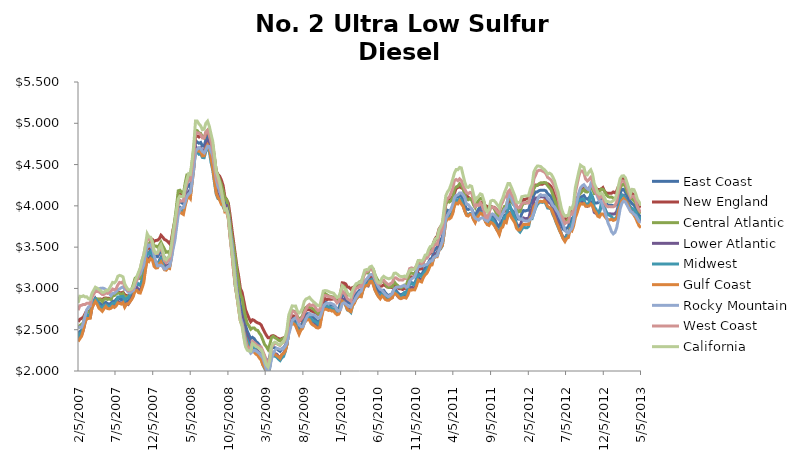
| Category | East Coast | New England  | Central Atlantic  | Lower Atlantic  | Midwest | Gulf Coast | Rocky Mountain | West Coast | California |
|---|---|---|---|---|---|---|---|---|---|
| 2/5/07 | 2.451 | 2.595 | 2.518 | 2.393 | 2.398 | 2.357 | 2.536 | 2.736 | 2.825 |
| 2/12/07 | 2.478 | 2.627 | 2.55 | 2.417 | 2.454 | 2.391 | 2.529 | 2.791 | 2.905 |
| 2/19/07 | 2.494 | 2.637 | 2.567 | 2.433 | 2.461 | 2.42 | 2.529 | 2.796 | 2.901 |
| 2/26/07 | 2.538 | 2.652 | 2.583 | 2.494 | 2.542 | 2.493 | 2.581 | 2.806 | 2.911 |
| 3/5/07 | 2.619 | 2.694 | 2.667 | 2.581 | 2.617 | 2.588 | 2.663 | 2.805 | 2.897 |
| 3/12/07 | 2.681 | 2.732 | 2.712 | 2.656 | 2.681 | 2.636 | 2.741 | 2.82 | 2.899 |
| 3/19/07 | 2.675 | 2.721 | 2.715 | 2.643 | 2.677 | 2.637 | 2.775 | 2.822 | 2.875 |
| 3/26/07 | 2.673 | 2.712 | 2.706 | 2.647 | 2.668 | 2.639 | 2.788 | 2.811 | 2.869 |
| 4/2/07 | 2.782 | 2.783 | 2.818 | 2.76 | 2.791 | 2.762 | 2.89 | 2.893 | 2.939 |
| 4/9/07 | 2.83 | 2.819 | 2.847 | 2.821 | 2.85 | 2.805 | 2.956 | 2.93 | 2.978 |
| 4/16/07 | 2.875 | 2.868 | 2.88 | 2.874 | 2.874 | 2.842 | 2.986 | 2.965 | 3.015 |
| 4/23/07 | 2.85 | 2.862 | 2.874 | 2.833 | 2.847 | 2.809 | 2.984 | 2.962 | 3.004 |
| 4/30/07 | 2.829 | 2.868 | 2.871 | 2.798 | 2.794 | 2.762 | 2.994 | 2.961 | 2.987 |
| 5/7/07 | 2.813 | 2.872 | 2.865 | 2.773 | 2.779 | 2.743 | 3.002 | 2.943 | 2.974 |
| 5/14/07 | 2.787 | 2.864 | 2.841 | 2.744 | 2.762 | 2.722 | 3.004 | 2.927 | 2.952 |
| 5/21/07 | 2.82 | 2.881 | 2.869 | 2.782 | 2.792 | 2.754 | 3 | 2.928 | 2.955 |
| 5/28/07 | 2.833 | 2.885 | 2.878 | 2.799 | 2.802 | 2.782 | 2.986 | 2.946 | 2.975 |
| 6/4/07 | 2.815 | 2.88 | 2.867 | 2.774 | 2.787 | 2.757 | 2.965 | 2.939 | 2.972 |
| 6/11/07 | 2.812 | 2.88 | 2.872 | 2.765 | 2.779 | 2.752 | 2.944 | 2.949 | 2.997 |
| 6/18/07 | 2.818 | 2.873 | 2.867 | 2.78 | 2.792 | 2.759 | 2.913 | 2.968 | 3.033 |
| 6/25/07 | 2.846 | 2.92 | 2.913 | 2.797 | 2.82 | 2.782 | 2.941 | 2.993 | 3.073 |
| 7/2/07 | 2.841 | 2.93 | 2.914 | 2.786 | 2.819 | 2.77 | 2.942 | 2.982 | 3.067 |
| 7/9/07 | 2.866 | 2.942 | 2.933 | 2.815 | 2.832 | 2.787 | 2.962 | 2.996 | 3.09 |
| 7/16/07 | 2.888 | 2.959 | 2.945 | 2.846 | 2.896 | 2.825 | 2.983 | 3.042 | 3.147 |
| 7/23/07 | 2.877 | 2.95 | 2.941 | 2.83 | 2.899 | 2.819 | 2.994 | 3.073 | 3.158 |
| 7/30/07 | 2.862 | 2.946 | 2.919 | 2.817 | 2.902 | 2.811 | 3.009 | 3.066 | 3.152 |
| 8/6/07 | 2.878 | 2.955 | 2.941 | 2.831 | 2.904 | 2.828 | 3.018 | 3.083 | 3.14 |
| 8/13/07 | 2.834 | 2.923 | 2.898 | 2.785 | 2.855 | 2.773 | 2.989 | 3.023 | 3.054 |
| 8/20/07 | 2.851 | 2.915 | 2.899 | 2.814 | 2.878 | 2.81 | 2.984 | 3.001 | 3.016 |
| 8/27/07 | 2.844 | 2.906 | 2.895 | 2.806 | 2.885 | 2.81 | 2.954 | 2.973 | 2.986 |
| 9/3/07 | 2.876 | 2.915 | 2.931 | 2.84 | 2.925 | 2.838 | 2.946 | 2.976 | 2.985 |
| 9/10/07 | 2.921 | 2.968 | 2.989 | 2.877 | 2.957 | 2.866 | 2.961 | 2.986 | 2.995 |
| 9/17/07 | 2.973 | 3.025 | 3.051 | 2.924 | 2.996 | 2.904 | 2.976 | 3.006 | 3.023 |
| 9/24/07 | 3.047 | 3.1 | 3.123 | 2.998 | 3.065 | 2.973 | 3.032 | 3.062 | 3.093 |
| 10/1/07 | 3.062 | 3.117 | 3.138 | 3.012 | 3.075 | 2.977 | 3.105 | 3.1 | 3.143 |
| 10/8/07 | 3.045 | 3.123 | 3.134 | 2.985 | 3.045 | 2.948 | 3.145 | 3.178 | 3.197 |
| 10/15/07 | 3.039 | 3.122 | 3.123 | 2.981 | 3.044 | 2.944 | 3.174 | 3.24 | 3.249 |
| 10/22/07 | 3.096 | 3.182 | 3.192 | 3.031 | 3.085 | 3.002 | 3.236 | 3.334 | 3.338 |
| 10/29/07 | 3.163 | 3.25 | 3.252 | 3.103 | 3.137 | 3.069 | 3.283 | 3.405 | 3.406 |
| 11/5/07 | 3.299 | 3.375 | 3.384 | 3.243 | 3.291 | 3.224 | 3.413 | 3.514 | 3.524 |
| 11/12/07 | 3.423 | 3.484 | 3.522 | 3.362 | 3.425 | 3.35 | 3.535 | 3.61 | 3.663 |
| 11/19/07 | 3.423 | 3.488 | 3.524 | 3.362 | 3.416 | 3.327 | 3.511 | 3.592 | 3.624 |
| 11/26/07 | 3.467 | 3.59 | 3.573 | 3.395 | 3.444 | 3.362 | 3.53 | 3.591 | 3.62 |
| 12/3/07 | 3.463 | 3.595 | 3.57 | 3.392 | 3.413 | 3.347 | 3.492 | 3.543 | 3.567 |
| 12/10/07 | 3.398 | 3.57 | 3.513 | 3.316 | 3.306 | 3.268 | 3.403 | 3.451 | 3.455 |
| 12/17/07 | 3.387 | 3.581 | 3.514 | 3.295 | 3.292 | 3.248 | 3.325 | 3.425 | 3.426 |
| 12/24/07 | 3.384 | 3.584 | 3.5 | 3.289 | 3.295 | 3.25 | 3.272 | 3.422 | 3.434 |
| 12/31/07 | 3.421 | 3.6 | 3.525 | 3.336 | 3.325 | 3.297 | 3.275 | 3.463 | 3.491 |
| 1/7/08 | 3.458 | 3.644 | 3.56 | 3.377 | 3.361 | 3.322 | 3.281 | 3.484 | 3.526 |
| 1/14/08 | 3.42 | 3.621 | 3.517 | 3.339 | 3.309 | 3.271 | 3.266 | 3.431 | 3.459 |
| 1/21/08 | 3.375 | 3.594 | 3.479 | 3.287 | 3.249 | 3.226 | 3.234 | 3.336 | 3.36 |
| 1/28/08 | 3.353 | 3.583 | 3.438 | 3.276 | 3.236 | 3.221 | 3.241 | 3.313 | 3.346 |
| 2/4/08 | 3.358 | 3.566 | 3.444 | 3.284 | 3.258 | 3.249 | 3.264 | 3.336 | 3.377 |
| 2/11/08 | 3.344 | 3.542 | 3.418 | 3.278 | 3.264 | 3.241 | 3.269 | 3.357 | 3.393 |
| 2/18/08 | 3.459 | 3.588 | 3.534 | 3.403 | 3.377 | 3.37 | 3.353 | 3.462 | 3.511 |
| 2/25/08 | 3.619 | 3.71 | 3.694 | 3.568 | 3.534 | 3.513 | 3.476 | 3.612 | 3.672 |
| 3/3/08 | 3.715 | 3.813 | 3.829 | 3.641 | 3.652 | 3.611 | 3.575 | 3.74 | 3.803 |
| 3/10/08 | 3.886 | 3.938 | 3.993 | 3.822 | 3.789 | 3.8 | 3.734 | 3.891 | 3.955 |
| 3/17/08 | 4.054 | 4.119 | 4.182 | 3.977 | 3.966 | 3.916 | 3.894 | 4.025 | 4.083 |
| 3/24/08 | 4.062 | 4.142 | 4.189 | 3.983 | 3.975 | 3.93 | 3.956 | 4.063 | 4.119 |
| 3/31/08 | 4.036 | 4.13 | 4.164 | 3.955 | 3.944 | 3.909 | 3.975 | 4.057 | 4.112 |
| 4/7/08 | 4.027 | 4.121 | 4.146 | 3.95 | 3.931 | 3.896 | 3.979 | 4.059 | 4.118 |
| 4/14/08 | 4.137 | 4.239 | 4.272 | 4.052 | 4.025 | 4.002 | 4.043 | 4.186 | 4.234 |
| 4/21/08 | 4.229 | 4.346 | 4.375 | 4.136 | 4.11 | 4.08 | 4.114 | 4.265 | 4.317 |
| 4/28/08 | 4.25 | 4.346 | 4.381 | 4.169 | 4.144 | 4.116 | 4.143 | 4.323 | 4.39 |
| 5/5/08 | 4.218 | 4.337 | 4.351 | 4.133 | 4.116 | 4.088 | 4.159 | 4.313 | 4.382 |
| 5/12/08 | 4.396 | 4.463 | 4.521 | 4.322 | 4.305 | 4.27 | 4.28 | 4.467 | 4.547 |
| 5/19/08 | 4.558 | 4.61 | 4.685 | 4.485 | 4.469 | 4.445 | 4.446 | 4.62 | 4.737 |
| 5/26/08 | 4.791 | 4.843 | 4.916 | 4.719 | 4.677 | 4.676 | 4.659 | 4.894 | 5.027 |
| 6/2/08 | 4.772 | 4.846 | 4.911 | 4.692 | 4.653 | 4.666 | 4.686 | 4.884 | 5.027 |
| 6/9/08 | 4.758 | 4.834 | 4.884 | 4.685 | 4.625 | 4.661 | 4.706 | 4.88 | 4.992 |
| 6/16/08 | 4.768 | 4.853 | 4.878 | 4.701 | 4.629 | 4.66 | 4.692 | 4.861 | 4.969 |
| 6/23/08 | 4.725 | 4.833 | 4.836 | 4.658 | 4.586 | 4.605 | 4.659 | 4.822 | 4.922 |
| 6/30/08 | 4.723 | 4.822 | 4.825 | 4.659 | 4.583 | 4.608 | 4.642 | 4.823 | 4.928 |
| 7/7/08 | 4.799 | 4.863 | 4.89 | 4.745 | 4.66 | 4.699 | 4.676 | 4.893 | 5.001 |
| 7/14/08 | 4.832 | 4.889 | 4.915 | 4.782 | 4.705 | 4.739 | 4.723 | 4.916 | 5.026 |
| 7/21/08 | 4.787 | 4.869 | 4.872 | 4.734 | 4.661 | 4.707 | 4.719 | 4.855 | 4.964 |
| 7/28/08 | 4.682 | 4.806 | 4.776 | 4.619 | 4.527 | 4.575 | 4.66 | 4.775 | 4.869 |
| 8/4/08 | 4.584 | 4.735 | 4.676 | 4.52 | 4.432 | 4.454 | 4.608 | 4.674 | 4.781 |
| 8/11/08 | 4.444 | 4.584 | 4.57 | 4.363 | 4.281 | 4.301 | 4.477 | 4.522 | 4.607 |
| 8/18/08 | 4.286 | 4.422 | 4.423 | 4.202 | 4.142 | 4.155 | 4.323 | 4.364 | 4.422 |
| 8/25/08 | 4.22 | 4.382 | 4.37 | 4.127 | 4.088 | 4.101 | 4.233 | 4.289 | 4.359 |
| 9/1/08 | 4.189 | 4.359 | 4.315 | 4.107 | 4.082 | 4.07 | 4.189 | 4.255 | 4.282 |
| 9/8/08 | 4.124 | 4.312 | 4.255 | 4.037 | 4.036 | 4.018 | 4.108 | 4.161 | 4.185 |
| 9/15/08 | 4.095 | 4.246 | 4.178 | 4.036 | 3.991 | 4.015 | 4.045 | 4.061 | 4.053 |
| 9/22/08 | 4.033 | 4.11 | 4.09 | 3.996 | 3.946 | 3.927 | 3.969 | 3.948 | 3.951 |
| 9/29/08 | 4.032 | 4.077 | 4.081 | 4.002 | 3.952 | 3.933 | 3.948 | 3.945 | 3.963 |
| 10/6/08 | 3.944 | 4.036 | 3.985 | 3.912 | 3.879 | 3.846 | 3.891 | 3.85 | 3.869 |
| 10/13/08 | 3.727 | 3.892 | 3.802 | 3.672 | 3.661 | 3.636 | 3.701 | 3.625 | 3.656 |
| 10/20/08 | 3.569 | 3.729 | 3.64 | 3.517 | 3.474 | 3.457 | 3.557 | 3.435 | 3.46 |
| 10/27/08 | 3.412 | 3.573 | 3.514 | 3.344 | 3.265 | 3.222 | 3.379 | 3.24 | 3.286 |
| 11/3/08 | 3.234 | 3.42 | 3.378 | 3.144 | 3.034 | 3.036 | 3.159 | 3.057 | 3.057 |
| 11/10/08 | 3.077 | 3.266 | 3.214 | 2.989 | 2.91 | 2.9 | 2.968 | 2.915 | 2.913 |
| 11/17/08 | 2.939 | 3.148 | 3.081 | 2.847 | 2.788 | 2.75 | 2.824 | 2.772 | 2.754 |
| 11/24/08 | 2.8 | 2.997 | 2.934 | 2.713 | 2.644 | 2.605 | 2.648 | 2.613 | 2.605 |
| 12/1/08 | 2.744 | 2.954 | 2.882 | 2.654 | 2.592 | 2.563 | 2.582 | 2.56 | 2.538 |
| 12/8/08 | 2.638 | 2.849 | 2.751 | 2.56 | 2.504 | 2.472 | 2.453 | 2.426 | 2.402 |
| 12/15/08 | 2.547 | 2.74 | 2.65 | 2.476 | 2.415 | 2.384 | 2.356 | 2.309 | 2.292 |
| 12/22/08 | 2.482 | 2.689 | 2.576 | 2.415 | 2.369 | 2.311 | 2.277 | 2.278 | 2.251 |
| 12/29/08 | 2.435 | 2.638 | 2.545 | 2.362 | 2.325 | 2.268 | 2.255 | 2.278 | 2.241 |
| 1/5/09 | 2.391 | 2.596 | 2.505 | 2.315 | 2.282 | 2.232 | 2.216 | 2.281 | 2.239 |
| 1/12/09 | 2.407 | 2.621 | 2.522 | 2.331 | 2.304 | 2.246 | 2.236 | 2.359 | 2.334 |
| 1/19/09 | 2.391 | 2.613 | 2.521 | 2.306 | 2.281 | 2.228 | 2.25 | 2.344 | 2.319 |
| 1/26/09 | 2.358 | 2.595 | 2.498 | 2.268 | 2.245 | 2.204 | 2.243 | 2.325 | 2.296 |
| 2/2/09 | 2.341 | 2.583 | 2.492 | 2.245 | 2.212 | 2.191 | 2.229 | 2.309 | 2.288 |
| 2/9/09 | 2.315 | 2.576 | 2.459 | 2.219 | 2.183 | 2.157 | 2.212 | 2.298 | 2.269 |
| 2/16/09 | 2.268 | 2.559 | 2.429 | 2.161 | 2.144 | 2.135 | 2.184 | 2.291 | 2.262 |
| 2/23/09 | 2.216 | 2.514 | 2.377 | 2.108 | 2.076 | 2.075 | 2.16 | 2.243 | 2.219 |
| 3/2/09 | 2.17 | 2.472 | 2.322 | 2.067 | 2.034 | 2.043 | 2.094 | 2.19 | 2.144 |
| 3/9/09 | 2.138 | 2.434 | 2.296 | 2.033 | 1.988 | 2.007 | 2.02 | 2.126 | 2.075 |
| 3/16/09 | 2.107 | 2.403 | 2.261 | 2.004 | 1.964 | 1.974 | 1.991 | 2.098 | 2.049 |
| 3/23/09 | 2.173 | 2.403 | 2.319 | 2.083 | 2.037 | 2.06 | 2.037 | 2.151 | 2.129 |
| 3/30/09 | 2.288 | 2.424 | 2.402 | 2.222 | 2.18 | 2.204 | 2.145 | 2.285 | 2.297 |
| 4/6/09 | 2.285 | 2.429 | 2.421 | 2.208 | 2.182 | 2.211 | 2.213 | 2.312 | 2.335 |
| 4/13/09 | 2.281 | 2.42 | 2.402 | 2.209 | 2.179 | 2.202 | 2.249 | 2.338 | 2.35 |
| 4/20/09 | 2.274 | 2.403 | 2.392 | 2.205 | 2.169 | 2.186 | 2.273 | 2.332 | 2.34 |
| 4/27/09 | 2.252 | 2.395 | 2.374 | 2.18 | 2.145 | 2.172 | 2.27 | 2.319 | 2.32 |
| 5/4/09 | 2.238 | 2.382 | 2.364 | 2.163 | 2.127 | 2.154 | 2.261 | 2.309 | 2.316 |
| 5/11/09 | 2.265 | 2.395 | 2.385 | 2.193 | 2.16 | 2.199 | 2.269 | 2.335 | 2.337 |
| 5/18/09 | 2.283 | 2.401 | 2.396 | 2.218 | 2.176 | 2.21 | 2.274 | 2.346 | 2.354 |
| 5/25/09 | 2.309 | 2.409 | 2.409 | 2.252 | 2.236 | 2.242 | 2.302 | 2.389 | 2.407 |
| 6/1/09 | 2.371 | 2.438 | 2.455 | 2.326 | 2.325 | 2.322 | 2.344 | 2.464 | 2.502 |
| 6/8/09 | 2.519 | 2.566 | 2.617 | 2.469 | 2.478 | 2.473 | 2.442 | 2.608 | 2.676 |
| 6/15/09 | 2.605 | 2.651 | 2.695 | 2.559 | 2.55 | 2.544 | 2.52 | 2.66 | 2.734 |
| 6/22/09 | 2.639 | 2.67 | 2.729 | 2.594 | 2.591 | 2.583 | 2.613 | 2.725 | 2.789 |
| 6/29/09 | 2.633 | 2.666 | 2.725 | 2.586 | 2.583 | 2.569 | 2.629 | 2.717 | 2.785 |
| 7/6/09 | 2.614 | 2.656 | 2.713 | 2.564 | 2.569 | 2.548 | 2.646 | 2.712 | 2.787 |
| 7/13/09 | 2.564 | 2.623 | 2.662 | 2.512 | 2.518 | 2.495 | 2.618 | 2.648 | 2.727 |
| 7/20/09 | 2.518 | 2.6 | 2.628 | 2.46 | 2.475 | 2.445 | 2.558 | 2.605 | 2.703 |
| 7/27/09 | 2.553 | 2.613 | 2.64 | 2.508 | 2.504 | 2.495 | 2.539 | 2.623 | 2.72 |
| 8/3/09 | 2.582 | 2.637 | 2.668 | 2.537 | 2.526 | 2.514 | 2.535 | 2.652 | 2.763 |
| 8/10/09 | 2.668 | 2.701 | 2.753 | 2.626 | 2.607 | 2.581 | 2.572 | 2.707 | 2.842 |
| 8/17/09 | 2.69 | 2.739 | 2.77 | 2.649 | 2.629 | 2.608 | 2.632 | 2.748 | 2.872 |
| 8/24/09 | 2.695 | 2.741 | 2.78 | 2.652 | 2.641 | 2.624 | 2.67 | 2.79 | 2.88 |
| 8/31/09 | 2.693 | 2.742 | 2.777 | 2.651 | 2.656 | 2.619 | 2.69 | 2.806 | 2.893 |
| 9/7/09 | 2.661 | 2.729 | 2.767 | 2.606 | 2.632 | 2.576 | 2.681 | 2.791 | 2.866 |
| 9/14/09 | 2.653 | 2.72 | 2.753 | 2.601 | 2.611 | 2.557 | 2.681 | 2.801 | 2.847 |
| 9/21/09 | 2.635 | 2.708 | 2.737 | 2.582 | 2.602 | 2.545 | 2.676 | 2.79 | 2.827 |
| 9/28/09 | 2.612 | 2.703 | 2.712 | 2.557 | 2.589 | 2.526 | 2.656 | 2.751 | 2.807 |
| 10/5/09 | 2.591 | 2.686 | 2.695 | 2.535 | 2.568 | 2.52 | 2.643 | 2.73 | 2.792 |
| 10/12/09 | 2.612 | 2.69 | 2.72 | 2.556 | 2.586 | 2.532 | 2.648 | 2.74 | 2.791 |
| 10/19/09 | 2.718 | 2.752 | 2.829 | 2.665 | 2.697 | 2.646 | 2.703 | 2.825 | 2.874 |
| 10/26/09 | 2.822 | 2.843 | 2.922 | 2.774 | 2.798 | 2.741 | 2.775 | 2.907 | 2.968 |
| 11/2/09 | 2.837 | 2.878 | 2.939 | 2.786 | 2.792 | 2.749 | 2.809 | 2.914 | 2.974 |
| 11/9/09 | 2.824 | 2.866 | 2.925 | 2.774 | 2.784 | 2.747 | 2.821 | 2.91 | 2.972 |
| 11/16/09 | 2.813 | 2.868 | 2.911 | 2.763 | 2.776 | 2.734 | 2.818 | 2.901 | 2.964 |
| 11/23/09 | 2.807 | 2.868 | 2.905 | 2.757 | 2.77 | 2.738 | 2.823 | 2.898 | 2.954 |
| 11/30/09 | 2.796 | 2.869 | 2.899 | 2.743 | 2.756 | 2.725 | 2.815 | 2.889 | 2.948 |
| 12/7/09 | 2.796 | 2.874 | 2.895 | 2.744 | 2.75 | 2.727 | 2.805 | 2.885 | 2.942 |
| 12/14/09 | 2.774 | 2.87 | 2.868 | 2.723 | 2.727 | 2.699 | 2.782 | 2.856 | 2.915 |
| 12/21/09 | 2.746 | 2.853 | 2.84 | 2.694 | 2.716 | 2.681 | 2.738 | 2.825 | 2.891 |
| 12/28/09 | 2.754 | 2.862 | 2.856 | 2.699 | 2.714 | 2.689 | 2.726 | 2.841 | 2.902 |
| 1/4/10 | 2.831 | 2.935 | 2.931 | 2.777 | 2.776 | 2.751 | 2.744 | 2.908 | 2.959 |
| 1/11/10 | 2.925 | 3.068 | 3.025 | 2.867 | 2.848 | 2.847 | 2.813 | 2.971 | 3.032 |
| 1/18/10 | 2.928 | 3.065 | 3.023 | 2.872 | 2.839 | 2.831 | 2.826 | 2.947 | 3.008 |
| 1/25/10 | 2.888 | 3.055 | 2.986 | 2.828 | 2.796 | 2.8 | 2.816 | 2.915 | 2.987 |
| 2/1/10 | 2.838 | 3.017 | 2.927 | 2.781 | 2.739 | 2.744 | 2.796 | 2.876 | 2.95 |
| 2/8/10 | 2.824 | 3.014 | 2.921 | 2.763 | 2.732 | 2.729 | 2.779 | 2.86 | 2.92 |
| 2/15/10 | 2.815 | 2.991 | 2.905 | 2.756 | 2.71 | 2.719 | 2.775 | 2.846 | 2.902 |
| 2/22/10 | 2.879 | 3.011 | 2.967 | 2.827 | 2.793 | 2.793 | 2.825 | 2.918 | 2.98 |
| 3/1/10 | 2.907 | 3.018 | 3.013 | 2.848 | 2.828 | 2.82 | 2.85 | 2.956 | 3.023 |
| 3/8/10 | 2.936 | 3.015 | 3.037 | 2.882 | 2.87 | 2.873 | 2.89 | 3.003 | 3.057 |
| 3/15/10 | 2.952 | 3.018 | 3.055 | 2.898 | 2.896 | 2.897 | 2.923 | 3.005 | 3.065 |
| 3/22/10 | 2.977 | 3.032 | 3.079 | 2.925 | 2.923 | 2.904 | 2.953 | 3.027 | 3.072 |
| 3/29/10 | 2.97 | 3.029 | 3.075 | 2.916 | 2.911 | 2.899 | 2.967 | 3.027 | 3.073 |
| 4/5/10 | 3.034 | 3.054 | 3.136 | 2.987 | 2.989 | 2.978 | 3.043 | 3.113 | 3.147 |
| 4/12/10 | 3.085 | 3.086 | 3.186 | 3.04 | 3.05 | 3.023 | 3.081 | 3.187 | 3.221 |
| 4/19/10 | 3.085 | 3.103 | 3.189 | 3.037 | 3.05 | 3.035 | 3.109 | 3.203 | 3.228 |
| 4/26/10 | 3.08 | 3.105 | 3.186 | 3.03 | 3.057 | 3.038 | 3.136 | 3.211 | 3.227 |
| 5/3/10 | 3.131 | 3.138 | 3.238 | 3.081 | 3.1 | 3.083 | 3.166 | 3.243 | 3.26 |
| 5/10/10 | 3.141 | 3.161 | 3.246 | 3.092 | 3.106 | 3.087 | 3.169 | 3.233 | 3.269 |
| 5/17/10 | 3.114 | 3.142 | 3.232 | 3.059 | 3.07 | 3.043 | 3.156 | 3.204 | 3.238 |
| 5/24/10 | 3.045 | 3.098 | 3.165 | 2.986 | 2.988 | 2.978 | 3.107 | 3.132 | 3.162 |
| 5/31/10 | 3.01 | 3.064 | 3.121 | 2.955 | 2.942 | 2.935 | 3.061 | 3.082 | 3.094 |
| 6/7/10 | 2.977 | 3.045 | 3.09 | 2.92 | 2.906 | 2.9 | 3.02 | 3.058 | 3.068 |
| 6/14/10 | 2.953 | 3.025 | 3.067 | 2.895 | 2.893 | 2.875 | 2.989 | 3.054 | 3.068 |
| 6/21/10 | 2.976 | 3.029 | 3.088 | 2.921 | 2.935 | 2.908 | 2.98 | 3.093 | 3.125 |
| 6/28/10 | 2.977 | 3.044 | 3.091 | 2.92 | 2.931 | 2.893 | 2.955 | 3.099 | 3.147 |
| 7/5/10 | 2.946 | 3.033 | 3.055 | 2.889 | 2.893 | 2.866 | 2.927 | 3.077 | 3.132 |
| 7/12/10 | 2.923 | 3.017 | 3.022 | 2.871 | 2.866 | 2.857 | 2.911 | 3.057 | 3.123 |
| 7/19/10 | 2.913 | 3.015 | 3.012 | 2.861 | 2.866 | 2.859 | 2.902 | 3.042 | 3.116 |
| 7/26/10 | 2.928 | 3.014 | 3.02 | 2.88 | 2.891 | 2.875 | 2.92 | 3.06 | 3.125 |
| 8/2/10 | 2.934 | 3.009 | 3.02 | 2.89 | 2.9 | 2.887 | 2.937 | 3.071 | 3.132 |
| 8/9/10 | 3 | 3.027 | 3.086 | 2.962 | 2.966 | 2.947 | 2.991 | 3.124 | 3.183 |
| 8/16/10 | 2.977 | 3.024 | 3.055 | 2.94 | 2.953 | 2.933 | 3.011 | 3.129 | 3.186 |
| 8/23/10 | 2.952 | 3.009 | 3.038 | 2.91 | 2.927 | 2.916 | 3.016 | 3.114 | 3.171 |
| 8/30/10 | 2.93 | 2.996 | 3.02 | 2.886 | 2.909 | 2.888 | 3.019 | 3.101 | 3.15 |
| 9/6/10 | 2.923 | 2.995 | 3.007 | 2.88 | 2.9 | 2.876 | 3.021 | 3.104 | 3.145 |
| 9/13/10 | 2.932 | 2.987 | 3.019 | 2.89 | 2.92 | 2.887 | 3.031 | 3.101 | 3.142 |
| 9/20/10 | 2.949 | 2.997 | 3.041 | 2.905 | 2.944 | 2.89 | 3.037 | 3.12 | 3.15 |
| 9/27/10 | 2.946 | 3.004 | 3.034 | 2.904 | 2.928 | 2.883 | 3.014 | 3.121 | 3.139 |
| 10/4/10 | 2.997 | 3.04 | 3.095 | 2.952 | 2.99 | 2.92 | 3.024 | 3.165 | 3.179 |
| 10/11/10 | 3.065 | 3.118 | 3.178 | 3.011 | 3.055 | 2.982 | 3.085 | 3.239 | 3.215 |
| 10/18/10 | 3.072 | 3.14 | 3.188 | 3.016 | 3.063 | 2.979 | 3.112 | 3.249 | 3.232 |
| 10/25/10 | 3.064 | 3.136 | 3.18 | 3.008 | 3.048 | 2.985 | 3.128 | 3.243 | 3.229 |
| 11/1/10 | 3.063 | 3.147 | 3.181 | 3.005 | 3.049 | 2.982 | 3.141 | 3.242 | 3.237 |
| 11/8/10 | 3.114 | 3.17 | 3.225 | 3.061 | 3.102 | 3.03 | 3.199 | 3.273 | 3.279 |
| 11/15/10 | 3.187 | 3.23 | 3.303 | 3.133 | 3.167 | 3.1 | 3.278 | 3.329 | 3.339 |
| 11/22/10 | 3.172 | 3.235 | 3.293 | 3.115 | 3.156 | 3.087 | 3.265 | 3.316 | 3.34 |
| 11/29/10 | 3.166 | 3.237 | 3.288 | 3.108 | 3.144 | 3.078 | 3.272 | 3.3 | 3.328 |
| 12/6/10 | 3.206 | 3.315 | 3.328 | 3.144 | 3.175 | 3.132 | 3.276 | 3.321 | 3.352 |
| 12/13/10 | 3.248 | 3.373 | 3.364 | 3.187 | 3.205 | 3.163 | 3.285 | 3.361 | 3.403 |
| 12/20/10 | 3.26 | 3.375 | 3.381 | 3.197 | 3.229 | 3.183 | 3.29 | 3.366 | 3.407 |
| 12/27/10 | 3.313 | 3.406 | 3.428 | 3.256 | 3.278 | 3.226 | 3.311 | 3.405 | 3.47 |
| 1/3/11 | 3.357 | 3.427 | 3.47 | 3.303 | 3.303 | 3.279 | 3.332 | 3.443 | 3.507 |
| 1/10/11 | 3.364 | 3.45 | 3.478 | 3.308 | 3.302 | 3.284 | 3.334 | 3.445 | 3.516 |
| 1/17/11 | 3.448 | 3.56 | 3.556 | 3.392 | 3.371 | 3.366 | 3.374 | 3.509 | 3.562 |
| 1/24/11 | 3.48 | 3.609 | 3.59 | 3.421 | 3.392 | 3.382 | 3.388 | 3.531 | 3.602 |
| 1/31/11 | 3.494 | 3.633 | 3.611 | 3.432 | 3.399 | 3.384 | 3.396 | 3.533 | 3.612 |
| 2/7/11 | 3.565 | 3.717 | 3.682 | 3.501 | 3.475 | 3.455 | 3.459 | 3.63 | 3.707 |
| 2/14/11 | 3.587 | 3.749 | 3.7 | 3.524 | 3.479 | 3.489 | 3.511 | 3.671 | 3.747 |
| 2/21/11 | 3.62 | 3.769 | 3.734 | 3.557 | 3.517 | 3.522 | 3.568 | 3.729 | 3.799 |
| 2/28/11 | 3.764 | 3.903 | 3.875 | 3.703 | 3.661 | 3.656 | 3.698 | 3.892 | 3.964 |
| 3/7/11 | 3.908 | 4.046 | 4.014 | 3.85 | 3.823 | 3.812 | 3.845 | 4.046 | 4.122 |
| 3/14/11 | 3.946 | 4.081 | 4.061 | 3.885 | 3.859 | 3.842 | 3.888 | 4.091 | 4.17 |
| 3/21/11 | 3.938 | 4.087 | 4.046 | 3.878 | 3.855 | 3.841 | 3.925 | 4.104 | 4.199 |
| 3/28/11 | 3.952 | 4.095 | 4.061 | 3.892 | 3.883 | 3.857 | 3.959 | 4.155 | 4.256 |
| 4/4/11 | 3.982 | 4.109 | 4.092 | 3.923 | 3.932 | 3.905 | 4.017 | 4.209 | 4.323 |
| 4/11/11 | 4.082 | 4.154 | 4.204 | 4.024 | 4.04 | 4.001 | 4.097 | 4.308 | 4.397 |
| 4/18/11 | 4.111 | 4.212 | 4.229 | 4.051 | 4.068 | 4.033 | 4.126 | 4.319 | 4.44 |
| 4/25/11 | 4.105 | 4.222 | 4.238 | 4.038 | 4.061 | 4.024 | 4.134 | 4.305 | 4.438 |
| 5/2/11 | 4.128 | 4.231 | 4.269 | 4.059 | 4.086 | 4.06 | 4.156 | 4.328 | 4.465 |
| 5/9/11 | 4.117 | 4.218 | 4.248 | 4.052 | 4.066 | 4.022 | 4.156 | 4.307 | 4.459 |
| 5/16/11 | 4.075 | 4.207 | 4.21 | 4.005 | 4.015 | 3.996 | 4.134 | 4.248 | 4.371 |
| 5/23/11 | 4.011 | 4.161 | 4.138 | 3.943 | 3.942 | 3.935 | 4.101 | 4.201 | 4.287 |
| 5/30/11 | 3.962 | 4.121 | 4.082 | 3.897 | 3.896 | 3.884 | 4.02 | 4.161 | 4.227 |
| 6/6/11 | 3.955 | 4.105 | 4.074 | 3.891 | 3.889 | 3.877 | 4.015 | 4.146 | 4.223 |
| 6/13/11 | 3.968 | 4.087 | 4.088 | 3.905 | 3.905 | 3.896 | 3.988 | 4.163 | 4.245 |
| 6/20/11 | 3.962 | 4.077 | 4.074 | 3.904 | 3.904 | 3.896 | 3.959 | 4.156 | 4.236 |
| 6/27/11 | 3.914 | 4.038 | 4.014 | 3.86 | 3.842 | 3.834 | 3.885 | 4.069 | 4.146 |
| 7/4/11 | 3.87 | 4.009 | 3.978 | 3.812 | 3.818 | 3.798 | 3.851 | 3.993 | 4.065 |
| 7/11/11 | 3.926 | 4.012 | 4.034 | 3.872 | 3.875 | 3.856 | 3.838 | 4.012 | 4.099 |
| 7/18/11 | 3.963 | 4.034 | 4.066 | 3.912 | 3.903 | 3.882 | 3.827 | 4.005 | 4.114 |
| 7/25/11 | 3.988 | 4.037 | 4.09 | 3.94 | 3.925 | 3.913 | 3.848 | 4.038 | 4.145 |
| 8/1/11 | 3.974 | 4.045 | 4.09 | 3.918 | 3.918 | 3.904 | 3.855 | 4 | 4.136 |
| 8/8/11 | 3.936 | 4.031 | 4.053 | 3.877 | 3.875 | 3.868 | 3.851 | 3.949 | 4.067 |
| 8/15/11 | 3.871 | 4.001 | 3.983 | 3.811 | 3.815 | 3.806 | 3.826 | 3.863 | 3.957 |
| 8/22/11 | 3.844 | 3.994 | 3.944 | 3.788 | 3.789 | 3.772 | 3.815 | 3.855 | 3.928 |
| 8/29/11 | 3.843 | 3.977 | 3.93 | 3.793 | 3.803 | 3.763 | 3.839 | 3.908 | 3.958 |
| 9/5/11 | 3.886 | 3.994 | 3.987 | 3.833 | 3.852 | 3.8 | 3.89 | 3.981 | 4.058 |
| 9/12/11 | 3.879 | 3.985 | 3.985 | 3.825 | 3.841 | 3.79 | 3.903 | 3.984 | 4.067 |
| 9/19/11 | 3.853 | 3.983 | 3.968 | 3.792 | 3.799 | 3.765 | 3.892 | 3.977 | 4.062 |
| 9/26/11 | 3.804 | 3.963 | 3.922 | 3.739 | 3.738 | 3.73 | 3.867 | 3.957 | 4.039 |
| 10/3/11 | 3.765 | 3.941 | 3.881 | 3.699 | 3.699 | 3.693 | 3.846 | 3.927 | 4.007 |
| 10/10/11 | 3.741 | 3.912 | 3.86 | 3.674 | 3.671 | 3.651 | 3.828 | 3.91 | 3.977 |
| 10/17/11 | 3.815 | 3.907 | 3.922 | 3.761 | 3.754 | 3.726 | 3.885 | 4.01 | 4.053 |
| 10/24/11 | 3.832 | 3.925 | 3.946 | 3.775 | 3.782 | 3.745 | 3.909 | 4.049 | 4.096 |
| 10/31/11 | 3.886 | 3.935 | 3.994 | 3.836 | 3.866 | 3.808 | 3.959 | 4.107 | 4.163 |
| 11/7/11 | 3.875 | 3.95 | 3.997 | 3.816 | 3.863 | 3.796 | 3.978 | 4.109 | 4.213 |
| 11/14/11 | 3.964 | 4.03 | 4.085 | 3.906 | 3.987 | 3.882 | 4.093 | 4.171 | 4.27 |
| 11/21/11 | 3.984 | 4.056 | 4.1 | 3.918 | 4.01 | 3.903 | 4.144 | 4.191 | 4.271 |
| 11/28/11 | 3.953 | 4.045 | 4.057 | 3.882 | 3.949 | 3.859 | 4.094 | 4.142 | 4.224 |
| 12/5/11 | 3.934 | 4.036 | 4.018 | 3.862 | 3.907 | 3.828 | 4.035 | 4.105 | 4.172 |
| 12/12/11 | 3.917 | 4.032 | 4.003 | 3.83 | 3.848 | 3.794 | 3.991 | 4.061 | 4.122 |
| 12/19/11 | 3.873 | 3.995 | 3.963 | 3.783 | 3.765 | 3.727 | 3.913 | 3.992 | 4.047 |
| 12/26/11 | 3.84 | 3.973 | 3.925 | 3.752 | 3.706 | 3.708 | 3.861 | 3.978 | 4.039 |
| 1/2/12 | 3.844 | 3.973 | 3.932 | 3.754 | 3.683 | 3.709 | 3.836 | 3.979 | 4.046 |
| 1/9/12 | 3.908 | 4.029 | 3.996 | 3.82 | 3.717 | 3.75 | 3.843 | 4.026 | 4.111 |
| 1/16/12 | 3.943 | 4.076 | 4.031 | 3.853 | 3.746 | 3.777 | 3.823 | 4.037 | 4.116 |
| 1/23/12 | 3.938 | 4.077 | 4.03 | 3.843 | 3.736 | 3.774 | 3.817 | 4.037 | 4.121 |
| 1/30/12 | 3.945 | 4.088 | 4.04 | 3.848 | 3.734 | 3.776 | 3.816 | 4.033 | 4.12 |
| 2/6/12 | 3.948 | 4.101 | 4.046 | 3.846 | 3.751 | 3.775 | 3.817 | 4.036 | 4.128 |
| 2/13/12 | 4.028 | 4.15 | 4.128 | 3.93 | 3.857 | 3.86 | 3.841 | 4.121 | 4.209 |
| 2/20/12 | 4.053 | 4.161 | 4.142 | 3.966 | 3.848 | 3.886 | 3.857 | 4.164 | 4.258 |
| 2/27/12 | 4.134 | 4.221 | 4.208 | 4.063 | 3.914 | 3.992 | 3.919 | 4.326 | 4.41 |
| 3/5/12 | 4.167 | 4.253 | 4.243 | 4.094 | 3.974 | 4.02 | 3.986 | 4.372 | 4.454 |
| 3/12/12 | 4.169 | 4.25 | 4.247 | 4.096 | 4.016 | 4.036 | 4.069 | 4.421 | 4.483 |
| 3/19/12 | 4.184 | 4.259 | 4.269 | 4.106 | 4.04 | 4.053 | 4.119 | 4.431 | 4.481 |
| 3/26/12 | 4.19 | 4.263 | 4.279 | 4.11 | 4.046 | 4.055 | 4.136 | 4.433 | 4.476 |
| 4/2/12 | 4.19 | 4.262 | 4.28 | 4.109 | 4.042 | 4.049 | 4.125 | 4.42 | 4.456 |
| 4/9/12 | 4.19 | 4.278 | 4.282 | 4.106 | 4.055 | 4.063 | 4.129 | 4.411 | 4.44 |
| 4/16/12 | 4.181 | 4.269 | 4.28 | 4.091 | 4.021 | 4.038 | 4.129 | 4.389 | 4.418 |
| 4/23/12 | 4.146 | 4.269 | 4.245 | 4.05 | 3.974 | 3.993 | 4.09 | 4.345 | 4.384 |
| 4/30/12 | 4.13 | 4.255 | 4.22 | 4.039 | 3.971 | 3.98 | 4.072 | 4.33 | 4.396 |
| 5/7/12 | 4.108 | 4.232 | 4.194 | 4.021 | 3.962 | 3.962 | 4.047 | 4.312 | 4.385 |
| 5/14/12 | 4.054 | 4.192 | 4.135 | 3.969 | 3.897 | 3.915 | 4.004 | 4.277 | 4.349 |
| 5/21/12 | 3.999 | 4.13 | 4.079 | 3.916 | 3.854 | 3.861 | 3.987 | 4.233 | 4.303 |
| 5/28/12 | 3.94 | 4.072 | 4.023 | 3.854 | 3.795 | 3.802 | 3.948 | 4.164 | 4.228 |
| 6/4/12 | 3.886 | 4.036 | 3.968 | 3.797 | 3.746 | 3.757 | 3.919 | 4.101 | 4.169 |
| 6/11/12 | 3.818 | 3.974 | 3.909 | 3.721 | 3.696 | 3.698 | 3.873 | 3.991 | 4.066 |
| 6/18/12 | 3.766 | 3.923 | 3.868 | 3.66 | 3.655 | 3.654 | 3.832 | 3.899 | 3.966 |
| 6/25/12 | 3.718 | 3.873 | 3.817 | 3.616 | 3.606 | 3.601 | 3.779 | 3.839 | 3.908 |
| 7/2/12 | 3.702 | 3.843 | 3.793 | 3.607 | 3.58 | 3.568 | 3.705 | 3.787 | 3.876 |
| 7/9/12 | 3.731 | 3.84 | 3.818 | 3.646 | 3.638 | 3.605 | 3.68 | 3.798 | 3.882 |
| 7/16/12 | 3.741 | 3.848 | 3.838 | 3.648 | 3.659 | 3.617 | 3.672 | 3.803 | 3.886 |
| 7/23/12 | 3.826 | 3.916 | 3.9 | 3.753 | 3.749 | 3.711 | 3.701 | 3.901 | 3.976 |
| 7/30/12 | 3.842 | 3.931 | 3.908 | 3.775 | 3.782 | 3.696 | 3.729 | 3.898 | 3.967 |
| 8/6/12 | 3.869 | 3.946 | 3.934 | 3.806 | 3.851 | 3.752 | 3.813 | 3.959 | 4.023 |
| 8/13/12 | 3.952 | 4.011 | 4.004 | 3.901 | 3.968 | 3.856 | 3.958 | 4.152 | 4.215 |
| 8/20/12 | 4.006 | 4.087 | 4.069 | 3.944 | 4.015 | 3.911 | 4.062 | 4.254 | 4.313 |
| 8/27/12 | 4.072 | 4.132 | 4.129 | 4.019 | 4.05 | 3.981 | 4.149 | 4.353 | 4.409 |
| 9/3/12 | 4.104 | 4.194 | 4.153 | 4.051 | 4.072 | 4.026 | 4.217 | 4.424 | 4.493 |
| 9/10/12 | 4.113 | 4.208 | 4.175 | 4.049 | 4.079 | 4.021 | 4.242 | 4.423 | 4.477 |
| 9/17/12 | 4.125 | 4.215 | 4.196 | 4.056 | 4.08 | 4.028 | 4.256 | 4.399 | 4.466 |
| 9/24/12 | 4.092 | 4.191 | 4.17 | 4.015 | 4.017 | 3.995 | 4.228 | 4.323 | 4.386 |
| 10/1/12 | 4.081 | 4.195 | 4.168 | 3.995 | 4.013 | 3.999 | 4.205 | 4.301 | 4.376 |
| 10/8/12 | 4.097 | 4.217 | 4.185 | 4.009 | 4.04 | 3.999 | 4.194 | 4.319 | 4.414 |
| 10/15/12 | 4.128 | 4.238 | 4.208 | 4.047 | 4.15 | 4.022 | 4.268 | 4.346 | 4.437 |
| 10/22/12 | 4.108 | 4.243 | 4.203 | 4.011 | 4.101 | 3.999 | 4.243 | 4.298 | 4.385 |
| 10/29/12 | 4.036 | 4.205 | 4.149 | 3.921 | 3.984 | 3.945 | 4.195 | 4.187 | 4.268 |
| 11/5/12 | 4.034 | 4.211 | 4.155 | 3.91 | 3.959 | 3.92 | 4.16 | 4.153 | 4.225 |
| 11/12/12 | 4.037 | 4.198 | 4.165 | 3.912 | 3.908 | 3.875 | 4.104 | 4.131 | 4.16 |
| 11/19/12 | 4.052 | 4.197 | 4.171 | 3.935 | 3.909 | 3.865 | 4.059 | 4.094 | 4.142 |
| 11/26/12 | 4.092 | 4.203 | 4.203 | 3.99 | 4.023 | 3.902 | 4.057 | 4.115 | 4.153 |
| 12/3/12 | 4.096 | 4.221 | 4.202 | 3.994 | 4.014 | 3.901 | 3.989 | 4.097 | 4.139 |
| 12/10/12 | 4.069 | 4.175 | 4.174 | 3.97 | 3.977 | 3.874 | 3.938 | 4.042 | 4.093 |
| 12/17/12 | 4.027 | 4.155 | 4.134 | 3.923 | 3.918 | 3.847 | 3.866 | 3.997 | 4.051 |
| 12/24/12 | 4.006 | 4.153 | 4.112 | 3.899 | 3.893 | 3.833 | 3.791 | 3.989 | 4.052 |
| 12/31/12 | 4.006 | 4.154 | 4.105 | 3.904 | 3.885 | 3.83 | 3.746 | 3.991 | 4.045 |
| 1/7/13 | 4.006 | 4.153 | 4.107 | 3.902 | 3.87 | 3.837 | 3.688 | 3.988 | 4.048 |
| 1/14/13 | 4.002 | 4.168 | 4.094 | 3.901 | 3.834 | 3.824 | 3.661 | 3.988 | 4.063 |
| 1/21/13 | 4 | 4.158 | 4.089 | 3.904 | 3.845 | 3.831 | 3.678 | 4.004 | 4.082 |
| 1/28/13 | 4.023 | 4.181 | 4.106 | 3.931 | 3.866 | 3.845 | 3.736 | 4.049 | 4.137 |
| 2/4/13 | 4.088 | 4.237 | 4.165 | 4.001 | 3.978 | 3.941 | 3.844 | 4.166 | 4.242 |
| 2/11/13 | 4.152 | 4.266 | 4.216 | 4.083 | 4.08 | 3.997 | 3.964 | 4.265 | 4.331 |
| 2/18/13 | 4.199 | 4.334 | 4.254 | 4.133 | 4.132 | 4.068 | 4.032 | 4.303 | 4.361 |
| 2/25/13 | 4.201 | 4.344 | 4.262 | 4.129 | 4.121 | 4.089 | 4.057 | 4.299 | 4.365 |
| 3/4/13 | 4.167 | 4.298 | 4.235 | 4.092 | 4.085 | 4.065 | 4.047 | 4.28 | 4.341 |
| 3/11/13 | 4.12 | 4.243 | 4.171 | 4.058 | 4.043 | 4.036 | 4.01 | 4.227 | 4.28 |
| 3/18/13 | 4.082 | 4.204 | 4.14 | 4.016 | 4.015 | 3.989 | 3.971 | 4.162 | 4.212 |
| 3/25/13 | 4.05 | 4.171 | 4.109 | 3.983 | 3.979 | 3.935 | 3.935 | 4.101 | 4.147 |
| 4/1/13 | 4.025 | 4.148 | 4.083 | 3.958 | 3.97 | 3.915 | 3.922 | 4.116 | 4.2 |
| 4/8/13 | 4.009 | 4.134 | 4.062 | 3.946 | 3.956 | 3.888 | 3.899 | 4.117 | 4.196 |
| 4/15/13 | 3.977 | 4.105 | 4.032 | 3.911 | 3.923 | 3.852 | 3.882 | 4.066 | 4.147 |
| 4/22/13 | 3.924 | 4.027 | 3.982 | 3.862 | 3.868 | 3.802 | 3.846 | 3.99 | 4.079 |
| 4/29/13 | 3.886 | 3.993 | 3.934 | 3.831 | 3.839 | 3.757 | 3.81 | 3.949 | 4.047 |
| 5/6/13 | 3.863 | 3.986 | 3.911 | 3.804 | 3.868 | 3.735 | 3.804 | 3.923 | 4.001 |